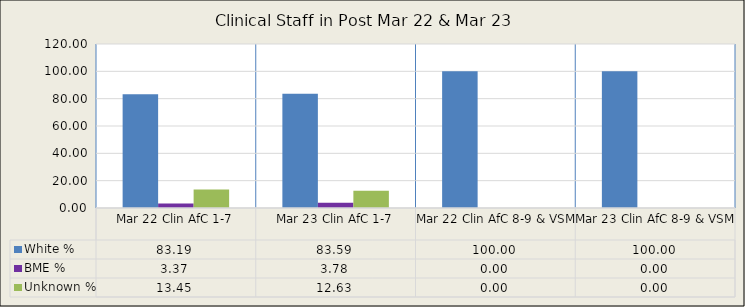
| Category | White % | BME % | Unknown % |
|---|---|---|---|
| Mar 22 Clin AfC 1-7 | 83.188 | 3.367 | 13.446 |
| Mar 23 Clin AfC 1-7 | 83.591 | 3.78 | 12.629 |
| Mar 22 Clin AfC 8-9 & VSM | 100 | 0 | 0 |
| Mar 23 Clin AfC 8-9 & VSM | 100 | 0 | 0 |